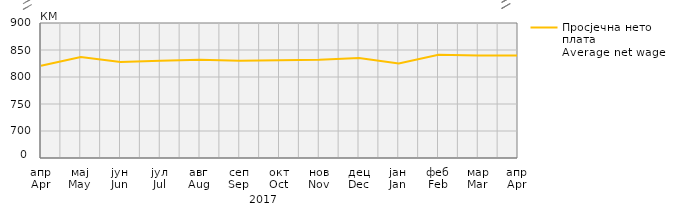
| Category | Просјечна нето плата
Average net wage |
|---|---|
| апр
Apr | 821 |
| мај
May | 837 |
| јун
Jun | 828 |
| јул
Jul | 830 |
| авг
Aug | 832 |
| сеп
Sep | 830 |
| окт
Oct | 831 |
| нов
Nov | 832 |
| дец
Dec | 835 |
| јан
Jan | 825 |
| феб
Feb | 841 |
| мар
Mar | 840 |
| апр
Apr | 840 |